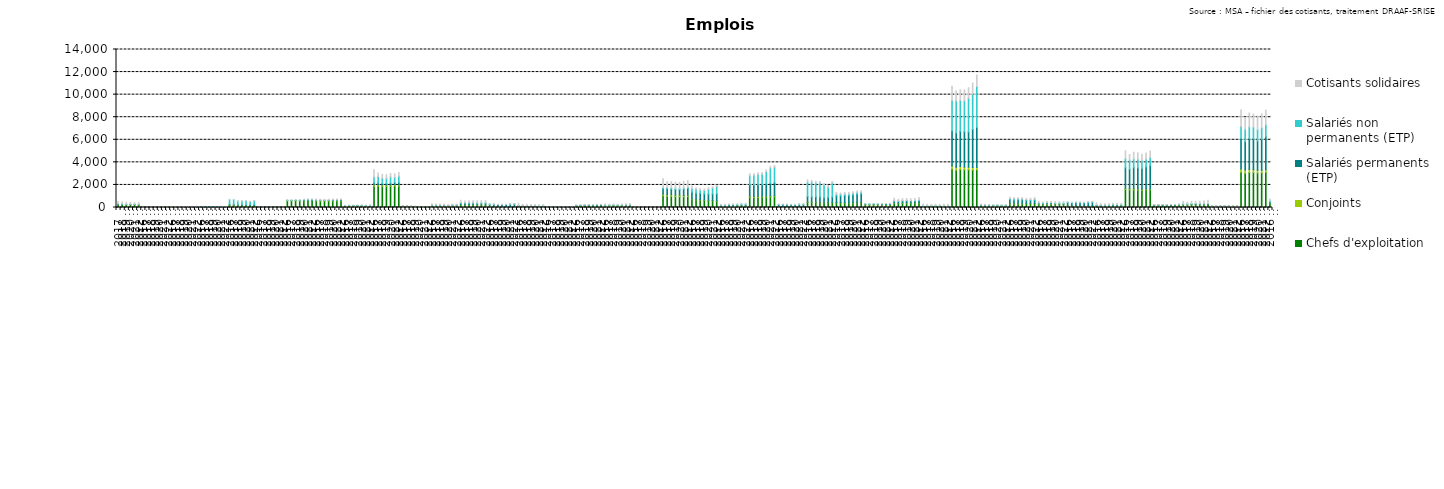
| Category | Chefs d'exploitation | Conjoints | Salariés permanents (ETP) | Salariés non permanents (ETP) | Cotisants solidaires |
|---|---|---|---|---|---|
| 0 | 295 | 10 | 5 | 45 | 170 |
| 1 | 270 | 15 | 10 | 40 | 170 |
| 2 | 245 | 10 | 10 | 40 | 155 |
| 3 | 255 | 10 | 5 | 40 | 130 |
| 4 | 250 | 10 | 5 | 35 | 130 |
| 5 | 240 | 10 | 10 | 40 | 125 |
| 6 | 15 | 0 | 0 | 0 | 25 |
| 7 | 15 | 0 | 0 | 0 | 15 |
| 8 | 20 | 0 | 0 | 0 | 15 |
| 9 | 25 | 0 | 0 | 0 | 25 |
| 10 | 20 | 5 | 0 | 0 | 20 |
| 11 | 25 | 5 | 0 | 0 | 30 |
| 12 | 30 | 5 | 0 | 0 | 30 |
| 13 | 45 | 5 | 0 | 10 | 25 |
| 14 | 50 | 5 | 5 | 10 | 15 |
| 15 | 45 | 10 | 5 | 10 | 20 |
| 16 | 50 | 5 | 5 | 10 | 15 |
| 17 | 50 | 10 | 0 | 10 | 25 |
| 18 | 60 | 10 | 0 | 10 | 25 |
| 19 | 65 | 10 | 0 | 20 | 25 |
| 20 | 20 | 0 | 25 | 20 | 0 |
| 21 | 20 | 0 | 25 | 20 | 0 |
| 22 | 20 | 0 | 25 | 20 | 0 |
| 23 | 20 | 0 | 25 | 20 | 0 |
| 24 | 20 | 0 | 30 | 35 | 0 |
| 25 | 20 | 0 | 35 | 40 | 5 |
| 26 | 20 | 0 | 35 | 35 | 5 |
| 27 | 195 | 15 | 85 | 400 | 25 |
| 28 | 195 | 15 | 60 | 425 | 15 |
| 29 | 185 | 15 | 50 | 315 | 20 |
| 30 | 190 | 15 | 50 | 315 | 15 |
| 31 | 185 | 10 | 55 | 355 | 20 |
| 32 | 185 | 10 | 60 | 275 | 20 |
| 33 | 180 | 10 | 65 | 355 | 20 |
| 34 | 10 | 0 | 5 | 5 | 5 |
| 35 | 5 | 0 | 5 | 5 | 5 |
| 36 | 5 | 0 | 5 | 10 | 0 |
| 37 | 10 | 0 | 5 | 10 | 5 |
| 38 | 10 | 5 | 5 | 5 | 0 |
| 39 | 10 | 5 | 5 | 5 | 5 |
| 40 | 15 | 5 | 5 | 15 | 5 |
| 41 | 580 | 30 | 10 | 40 | 30 |
| 42 | 580 | 30 | 10 | 40 | 20 |
| 43 | 595 | 30 | 10 | 45 | 25 |
| 44 | 585 | 30 | 10 | 45 | 20 |
| 45 | 605 | 30 | 20 | 60 | 20 |
| 46 | 610 | 30 | 30 | 50 | 20 |
| 47 | 610 | 25 | 35 | 55 | 25 |
| 48 | 585 | 50 | 20 | 15 | 80 |
| 49 | 575 | 45 | 30 | 15 | 60 |
| 50 | 570 | 40 | 25 | 20 | 70 |
| 51 | 580 | 35 | 25 | 20 | 70 |
| 52 | 575 | 35 | 40 | 35 | 65 |
| 53 | 575 | 35 | 45 | 30 | 75 |
| 54 | 585 | 30 | 50 | 35 | 75 |
| 55 | 160 | 5 | 5 | 10 | 25 |
| 56 | 170 | 5 | 5 | 10 | 15 |
| 57 | 170 | 5 | 5 | 10 | 15 |
| 58 | 170 | 10 | 5 | 10 | 20 |
| 59 | 170 | 10 | 5 | 10 | 15 |
| 60 | 160 | 10 | 10 | 15 | 15 |
| 61 | 165 | 10 | 5 | 10 | 15 |
| 62 | 1885 | 120 | 160 | 535 | 635 |
| 63 | 1905 | 115 | 145 | 575 | 320 |
| 64 | 1875 | 115 | 135 | 470 | 340 |
| 65 | 1870 | 110 | 135 | 470 | 325 |
| 66 | 1885 | 110 | 160 | 555 | 295 |
| 67 | 1905 | 115 | 180 | 465 | 320 |
| 68 | 1900 | 105 | 205 | 570 | 325 |
| 69 | 115 | 25 | 10 | 0 | 35 |
| 70 | 95 | 25 | 10 | 0 | 20 |
| 71 | 85 | 20 | 5 | 0 | 20 |
| 72 | 75 | 15 | 5 | 0 | 20 |
| 73 | 70 | 10 | 5 | 5 | 15 |
| 74 | 65 | 10 | 5 | 0 | 15 |
| 75 | 60 | 10 | 10 | 0 | 15 |
| 76 | 140 | 15 | 40 | 20 | 120 |
| 77 | 140 | 15 | 40 | 25 | 85 |
| 78 | 130 | 15 | 50 | 20 | 85 |
| 79 | 135 | 15 | 50 | 20 | 80 |
| 80 | 130 | 15 | 30 | 5 | 85 |
| 81 | 125 | 10 | 75 | 15 | 80 |
| 82 | 125 | 10 | 80 | 20 | 75 |
| 83 | 230 | 35 | 125 | 30 | 220 |
| 84 | 215 | 35 | 140 | 35 | 160 |
| 85 | 200 | 30 | 145 | 40 | 180 |
| 86 | 195 | 30 | 145 | 40 | 185 |
| 87 | 190 | 35 | 140 | 35 | 190 |
| 88 | 185 | 30 | 165 | 35 | 200 |
| 89 | 195 | 25 | 170 | 35 | 195 |
| 90 | 90 | 10 | 190 | 10 | 35 |
| 91 | 80 | 10 | 200 | 5 | 25 |
| 92 | 80 | 5 | 170 | 5 | 30 |
| 93 | 75 | 5 | 170 | 5 | 25 |
| 94 | 75 | 5 | 180 | 5 | 25 |
| 95 | 75 | 5 | 215 | 5 | 25 |
| 96 | 75 | 5 | 230 | 5 | 25 |
| 97 | 115 | 15 | 40 | 10 | 200 |
| 98 | 110 | 15 | 40 | 10 | 105 |
| 99 | 115 | 10 | 40 | 10 | 115 |
| 100 | 105 | 10 | 40 | 10 | 110 |
| 101 | 95 | 10 | 65 | 10 | 95 |
| 102 | 85 | 10 | 35 | 5 | 115 |
| 103 | 95 | 10 | 35 | 5 | 115 |
| 104 | 25 | 0 | 25 | 0 | 15 |
| 105 | 25 | 0 | 25 | 5 | 10 |
| 106 | 25 | 0 | 20 | 5 | 5 |
| 107 | 20 | 0 | 20 | 5 | 10 |
| 108 | 20 | 5 | 25 | 5 | 5 |
| 109 | 20 | 5 | 20 | 5 | 5 |
| 110 | 20 | 5 | 30 | 5 | 5 |
| 111 | 155 | 15 | 15 | 20 | 20 |
| 112 | 160 | 20 | 15 | 25 | 15 |
| 113 | 170 | 20 | 15 | 30 | 20 |
| 114 | 175 | 20 | 15 | 30 | 15 |
| 115 | 185 | 15 | 15 | 35 | 20 |
| 116 | 185 | 15 | 20 | 35 | 25 |
| 117 | 195 | 15 | 25 | 30 | 25 |
| 118 | 140 | 20 | 45 | 5 | 120 |
| 119 | 140 | 25 | 45 | 5 | 75 |
| 120 | 155 | 25 | 45 | 5 | 80 |
| 121 | 150 | 20 | 45 | 5 | 80 |
| 122 | 170 | 25 | 25 | 10 | 85 |
| 123 | 180 | 20 | 25 | 10 | 90 |
| 124 | 185 | 20 | 30 | 10 | 105 |
| 125 | 35 | 0 | 0 | 0 | 15 |
| 126 | 30 | 0 | 0 | 0 | 15 |
| 127 | 35 | 0 | 0 | 0 | 15 |
| 128 | 35 | 0 | 0 | 0 | 15 |
| 129 | 30 | 0 | 0 | 0 | 5 |
| 130 | 30 | 0 | 0 | 0 | 10 |
| 131 | 30 | 0 | 0 | 0 | 10 |
| 132 | 1040 | 140 | 490 | 95 | 780 |
| 133 | 1000 | 140 | 515 | 110 | 515 |
| 134 | 995 | 135 | 495 | 115 | 550 |
| 135 | 965 | 120 | 500 | 115 | 540 |
| 136 | 965 | 120 | 485 | 110 | 535 |
| 137 | 950 | 110 | 560 | 115 | 565 |
| 138 | 980 | 100 | 610 | 115 | 570 |
| 139 | 705 | 55 | 585 | 345 | 210 |
| 140 | 685 | 45 | 540 | 345 | 125 |
| 141 | 665 | 40 | 540 | 300 | 140 |
| 142 | 625 | 40 | 540 | 300 | 140 |
| 143 | 610 | 40 | 525 | 445 | 130 |
| 144 | 590 | 35 | 560 | 545 | 115 |
| 145 | 555 | 35 | 610 | 665 | 105 |
| 146 | 110 | 5 | 65 | 45 | 55 |
| 147 | 110 | 10 | 65 | 45 | 55 |
| 148 | 115 | 10 | 90 | 50 | 50 |
| 149 | 125 | 5 | 90 | 50 | 55 |
| 150 | 135 | 5 | 85 | 55 | 55 |
| 151 | 130 | 5 | 105 | 65 | 60 |
| 152 | 130 | 5 | 105 | 65 | 65 |
| 153 | 915 | 85 | 1010 | 800 | 175 |
| 154 | 880 | 90 | 1000 | 885 | 125 |
| 155 | 910 | 85 | 1010 | 930 | 145 |
| 156 | 925 | 80 | 1010 | 930 | 150 |
| 157 | 935 | 80 | 1055 | 1100 | 155 |
| 158 | 935 | 85 | 1120 | 1345 | 165 |
| 159 | 970 | 80 | 1145 | 1365 | 170 |
| 160 | 95 | 10 | 135 | 40 | 20 |
| 161 | 90 | 10 | 145 | 35 | 15 |
| 162 | 90 | 5 | 145 | 40 | 15 |
| 163 | 80 | 5 | 145 | 40 | 20 |
| 164 | 80 | 5 | 135 | 50 | 20 |
| 165 | 75 | 5 | 165 | 55 | 20 |
| 166 | 75 | 0 | 175 | 60 | 15 |
| 167 | 445 | 40 | 490 | 1265 | 210 |
| 168 | 435 | 35 | 475 | 1315 | 135 |
| 169 | 450 | 35 | 460 | 1225 | 140 |
| 170 | 440 | 35 | 460 | 1225 | 140 |
| 171 | 435 | 30 | 400 | 1130 | 130 |
| 172 | 430 | 30 | 430 | 915 | 135 |
| 173 | 430 | 30 | 460 | 1265 | 115 |
| 174 | 420 | 15 | 585 | 165 | 155 |
| 175 | 410 | 20 | 585 | 170 | 100 |
| 176 | 400 | 15 | 640 | 150 | 130 |
| 177 | 400 | 15 | 640 | 150 | 135 |
| 178 | 405 | 15 | 690 | 145 | 135 |
| 179 | 425 | 15 | 745 | 140 | 130 |
| 180 | 435 | 15 | 765 | 140 | 130 |
| 181 | 235 | 25 | 50 | 25 | 15 |
| 182 | 225 | 20 | 50 | 25 | 10 |
| 183 | 235 | 25 | 50 | 30 | 10 |
| 184 | 230 | 25 | 50 | 30 | 10 |
| 185 | 235 | 20 | 45 | 40 | 10 |
| 186 | 235 | 20 | 50 | 45 | 10 |
| 187 | 235 | 20 | 55 | 45 | 15 |
| 188 | 375 | 30 | 175 | 10 | 225 |
| 189 | 360 | 25 | 165 | 15 | 160 |
| 190 | 385 | 30 | 175 | 20 | 165 |
| 191 | 400 | 30 | 175 | 20 | 165 |
| 192 | 390 | 25 | 165 | 20 | 170 |
| 193 | 390 | 25 | 180 | 20 | 190 |
| 194 | 405 | 20 | 205 | 30 | 230 |
| 195 | 115 | 10 | 5 | 5 | 180 |
| 196 | 115 | 10 | 10 | 5 | 145 |
| 197 | 115 | 10 | 10 | 5 | 140 |
| 198 | 115 | 10 | 10 | 5 | 155 |
| 199 | 110 | 10 | 15 | 5 | 125 |
| 200 | 110 | 5 | 15 | 5 | 150 |
| 201 | 110 | 5 | 10 | 5 | 160 |
| 202 | 3410 | 270 | 3100 | 2705 | 1250 |
| 203 | 3310 | 265 | 3035 | 2845 | 860 |
| 204 | 3375 | 255 | 3115 | 2750 | 940 |
| 205 | 3340 | 240 | 3120 | 2750 | 965 |
| 206 | 3340 | 230 | 3115 | 2995 | 930 |
| 207 | 3320 | 225 | 3365 | 3140 | 975 |
| 208 | 3340 | 215 | 3525 | 3640 | 1010 |
| 209 | 155 | 10 | 45 | 30 | 75 |
| 210 | 150 | 10 | 35 | 30 | 35 |
| 211 | 145 | 10 | 40 | 25 | 40 |
| 212 | 140 | 10 | 40 | 25 | 30 |
| 213 | 135 | 10 | 45 | 25 | 30 |
| 214 | 130 | 10 | 40 | 25 | 30 |
| 215 | 125 | 10 | 55 | 25 | 30 |
| 216 | 330 | 45 | 335 | 80 | 110 |
| 217 | 325 | 45 | 305 | 90 | 100 |
| 218 | 340 | 40 | 305 | 90 | 100 |
| 219 | 330 | 40 | 310 | 90 | 105 |
| 220 | 330 | 40 | 255 | 70 | 115 |
| 221 | 330 | 40 | 245 | 90 | 115 |
| 222 | 335 | 30 | 280 | 95 | 130 |
| 223 | 245 | 60 | 80 | 40 | 120 |
| 224 | 235 | 55 | 70 | 50 | 75 |
| 225 | 250 | 55 | 85 | 45 | 100 |
| 226 | 255 | 50 | 85 | 45 | 90 |
| 227 | 245 | 45 | 60 | 55 | 100 |
| 228 | 245 | 40 | 60 | 55 | 105 |
| 229 | 250 | 40 | 65 | 45 | 115 |
| 230 | 130 | 15 | 290 | 45 | 25 |
| 231 | 130 | 15 | 250 | 50 | 25 |
| 232 | 130 | 15 | 265 | 45 | 30 |
| 233 | 130 | 15 | 265 | 50 | 25 |
| 234 | 135 | 15 | 235 | 50 | 25 |
| 235 | 135 | 15 | 265 | 75 | 30 |
| 236 | 155 | 15 | 270 | 80 | 30 |
| 237 | 130 | 15 | 50 | 40 | 175 |
| 238 | 125 | 15 | 50 | 40 | 105 |
| 239 | 130 | 15 | 50 | 35 | 105 |
| 240 | 135 | 10 | 50 | 35 | 100 |
| 241 | 135 | 10 | 80 | 60 | 95 |
| 242 | 125 | 10 | 85 | 55 | 100 |
| 243 | 135 | 10 | 70 | 45 | 110 |
| 244 | 1600 | 95 | 1810 | 825 | 695 |
| 245 | 1565 | 95 | 1715 | 820 | 510 |
| 246 | 1570 | 90 | 1865 | 765 | 605 |
| 247 | 1560 | 80 | 1865 | 765 | 570 |
| 248 | 1535 | 75 | 1820 | 720 | 565 |
| 249 | 1565 | 70 | 1960 | 670 | 555 |
| 250 | 1565 | 70 | 2080 | 720 | 570 |
| 251 | 185 | 20 | 25 | 15 | 20 |
| 252 | 180 | 25 | 25 | 15 | 15 |
| 253 | 190 | 20 | 30 | 20 | 15 |
| 254 | 185 | 20 | 30 | 20 | 15 |
| 255 | 190 | 20 | 25 | 25 | 15 |
| 256 | 190 | 15 | 30 | 30 | 20 |
| 257 | 200 | 20 | 35 | 30 | 20 |
| 258 | 230 | 25 | 50 | 10 | 225 |
| 259 | 225 | 25 | 50 | 10 | 160 |
| 260 | 235 | 20 | 75 | 5 | 210 |
| 261 | 245 | 20 | 75 | 5 | 205 |
| 262 | 245 | 15 | 65 | 10 | 225 |
| 263 | 250 | 15 | 65 | 10 | 245 |
| 264 | 265 | 15 | 70 | 15 | 270 |
| 265 | 115 | 10 | 5 | 5 | 25 |
| 266 | 105 | 10 | 5 | 5 | 20 |
| 267 | 115 | 5 | 5 | 0 | 20 |
| 268 | 110 | 10 | 5 | 0 | 25 |
| 269 | 105 | 10 | 5 | 5 | 20 |
| 270 | 100 | 10 | 5 | 0 | 20 |
| 271 | 100 | 10 | 5 | 0 | 30 |
| 272 | 3115 | 295 | 2685 | 1090 | 1460 |
| 273 | 3040 | 290 | 2505 | 1105 | 1045 |
| 274 | 3105 | 270 | 2725 | 1035 | 1230 |
| 275 | 3090 | 255 | 2730 | 1035 | 1165 |
| 276 | 3060 | 240 | 2580 | 1020 | 1195 |
| 277 | 3075 | 225 | 2755 | 1010 | 1220 |
| 278 | 3130 | 210 | 2930 | 1055 | 1300 |
| 279 | 355 | 20 | 105 | 125 | 155 |